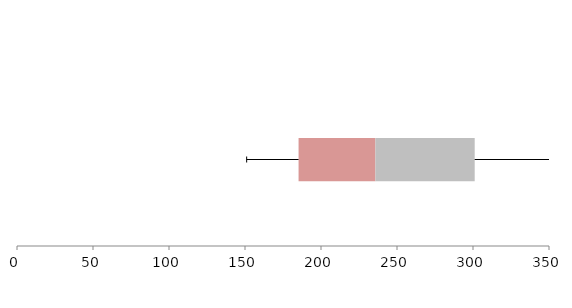
| Category | Series 1 | Series 2 | Series 3 |
|---|---|---|---|
| 0 | 185.246 | 50.551 | 65.319 |